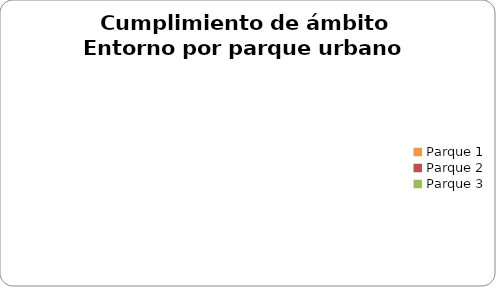
| Category | Entorno |
|---|---|
| Parque 1 | 0 |
| Parque 2 | 0 |
| Parque 3 | 0 |